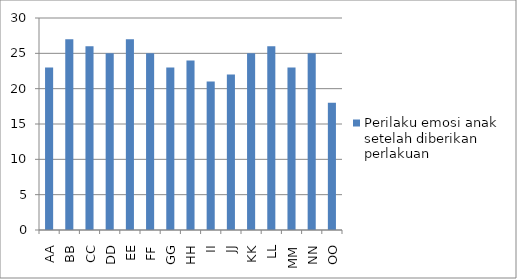
| Category | Perilaku emosi anak setelah diberikan perlakuan |
|---|---|
| AA | 23 |
| BB | 27 |
| CC | 26 |
| DD | 25 |
| EE | 27 |
| FF | 25 |
| GG | 23 |
| HH | 24 |
| II | 21 |
| JJ | 22 |
| KK | 25 |
| LL | 26 |
| MM | 23 |
| NN | 25 |
| OO | 18 |